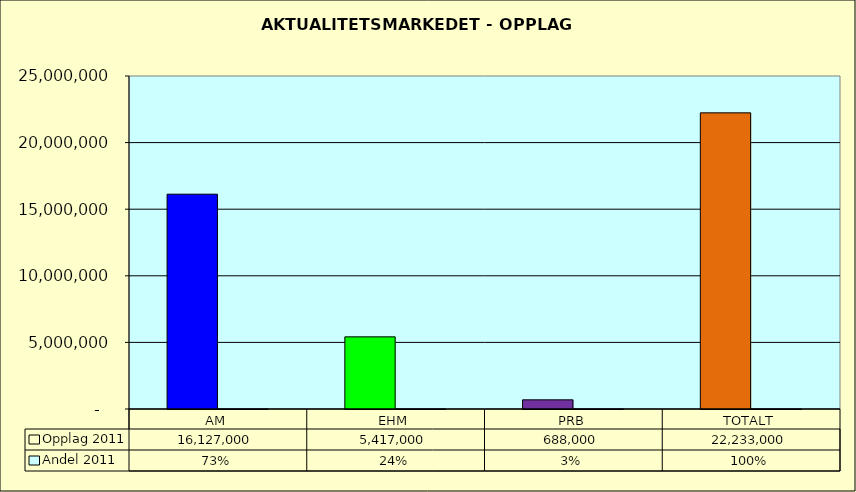
| Category | Opplag 2011 | Andel 2011 |
|---|---|---|
| AM | 16127000 | 0.725 |
| EHM | 5417000 | 0.244 |
| PRB | 688000 | 0.031 |
| TOTALT | 22233000 | 1 |